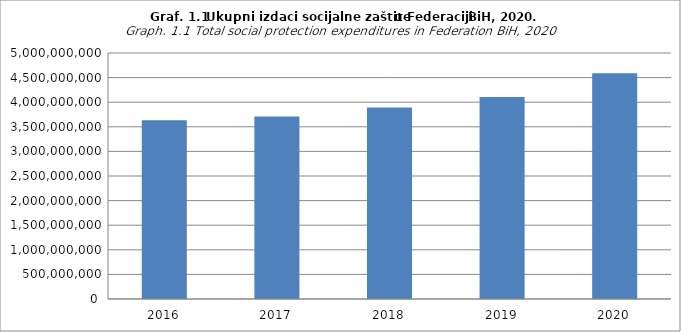
| Category | Ukupni izdaci socijalne zaštite  |
|---|---|
| 2016 | 3633713167.316 |
| 2017 | 3710279013.49 |
| 2018 | 3893455488.46 |
| 2019 | 4104612965.83 |
| 2020 | 4590725820.97 |